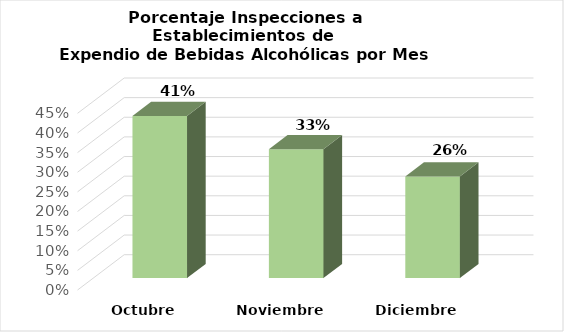
| Category | Series 0 |
|---|---|
| Octubre | 0.413 |
| Noviembre | 0.328 |
| Diciembre | 0.259 |